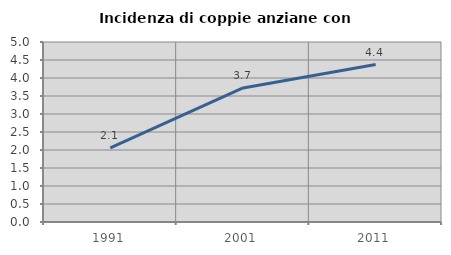
| Category | Incidenza di coppie anziane con figli |
|---|---|
| 1991.0 | 2.057 |
| 2001.0 | 3.723 |
| 2011.0 | 4.373 |